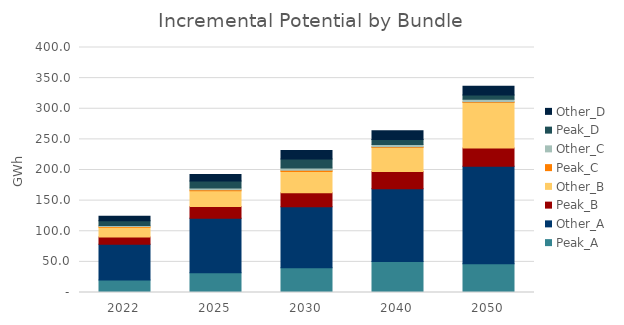
| Category | Peak_A | Other_A | Peak_B | Other_B | Peak_C | Other_C | Peak_D | Other_D |
|---|---|---|---|---|---|---|---|---|
| 2022.0 | 20.392 | 58.496 | 11.876 | 15.571 | 1.374 | 1.708 | 7.651 | 7.35 |
| 2025.0 | 32.352 | 88.841 | 19.335 | 25.431 | 1.927 | 2.777 | 11.244 | 10.771 |
| 2030.0 | 40.55 | 99.395 | 23.099 | 34.465 | 1.943 | 3.635 | 14.727 | 14.166 |
| 2040.0 | 50.42 | 119.136 | 27.858 | 39.161 | 1.396 | 3.68 | 8.095 | 14.464 |
| 2050.0 | 47.027 | 159.255 | 29.59 | 74.244 | 1.25 | 4.332 | 6.911 | 13.931 |